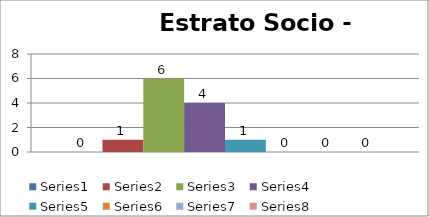
| Category | Series 0 | Series 1 | Series 2 | Series 3 | Series 4 | Series 5 | Series 6 | Series 7 |
|---|---|---|---|---|---|---|---|---|
| 0 | 0 | 1 | 6 | 4 | 1 | 0 | 0 | 0 |